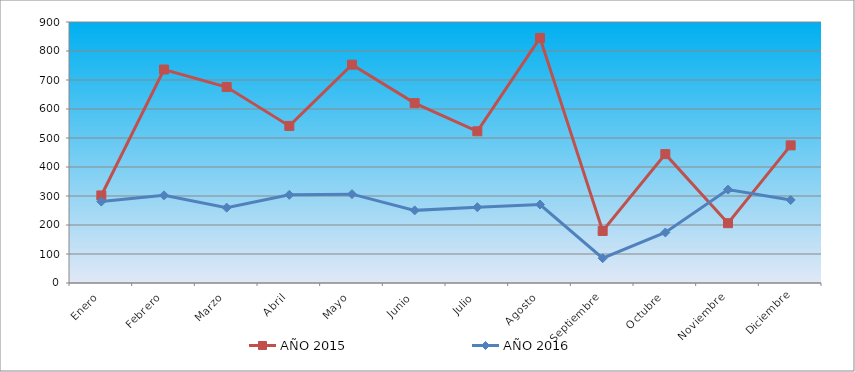
| Category | AÑO 2015 | AÑO 2016 |
|---|---|---|
| Enero | 301.839 | 280.713 |
| Febrero | 736.151 | 302.307 |
| Marzo | 675.783 | 259.773 |
| Abril | 541.633 | 303.968 |
| Mayo | 752.92 | 306.439 |
| Junio | 620.446 | 250.44 |
| Julio | 523.187 | 261.329 |
| Agosto | 845.148 | 270.662 |
| Septiembre | 179.426 | 85.554 |
| Octubre | 444.373 | 174.219 |
| Noviembre | 206.256 | 321.994 |
| Diciembre | 474.557 | 286.217 |